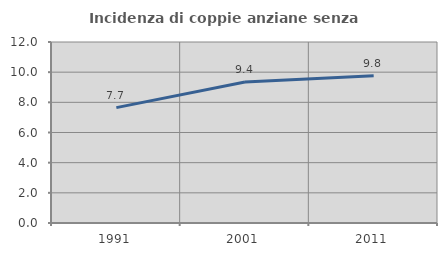
| Category | Incidenza di coppie anziane senza figli  |
|---|---|
| 1991.0 | 7.65 |
| 2001.0 | 9.351 |
| 2011.0 | 9.77 |